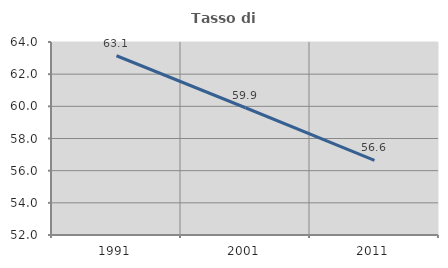
| Category | Tasso di occupazione   |
|---|---|
| 1991.0 | 63.144 |
| 2001.0 | 59.912 |
| 2011.0 | 56.638 |